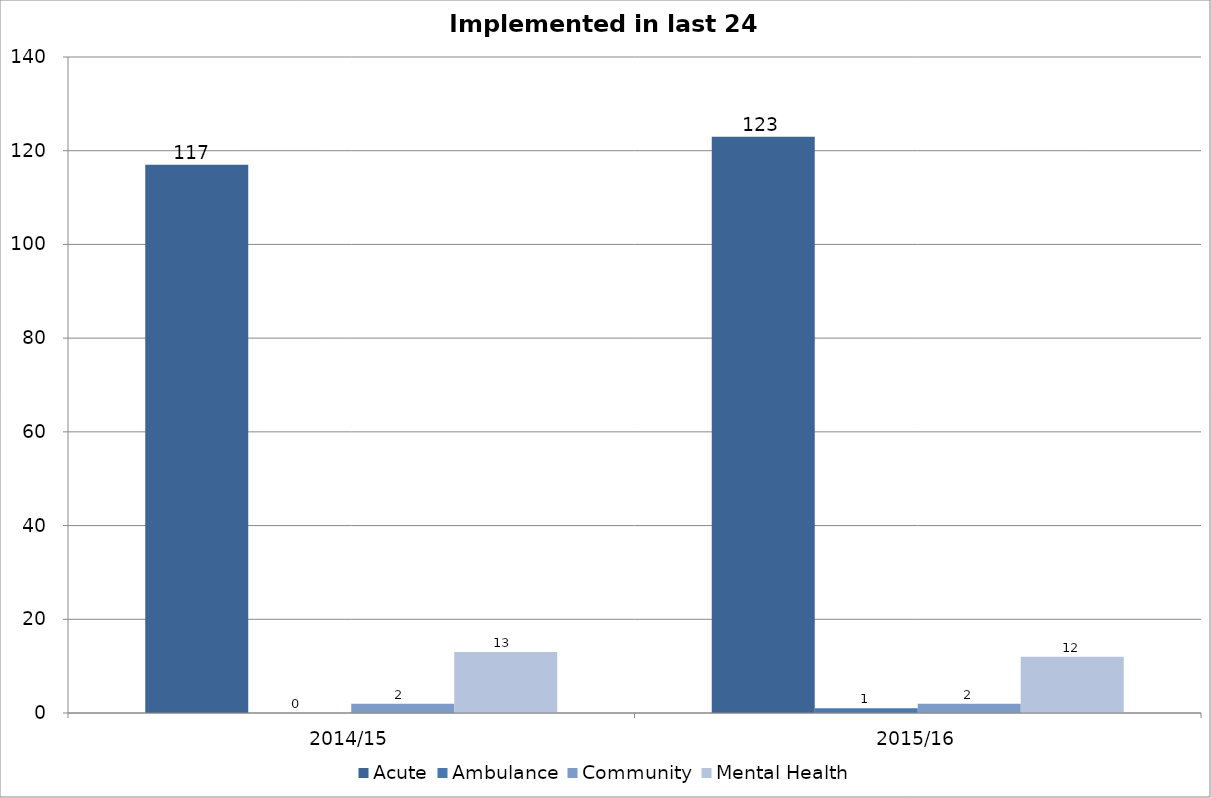
| Category | Acute | Ambulance | Community | Mental Health |
|---|---|---|---|---|
| 2014/15 | 117 | 0 | 2 | 13 |
| 2015/16 | 123 | 1 | 2 | 12 |